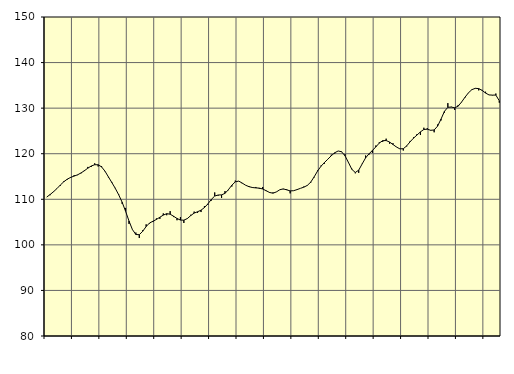
| Category | Piggar | Samtliga anställda (inkl. anställda utomlands) |
|---|---|---|
| nan | 110.5 | 110.49 |
| 87.0 | 110.9 | 111.05 |
| 87.0 | 111.6 | 111.67 |
| 87.0 | 112.4 | 112.37 |
| nan | 113 | 113.15 |
| 88.0 | 114 | 113.86 |
| 88.0 | 114.3 | 114.42 |
| 88.0 | 114.7 | 114.81 |
| nan | 115.3 | 115.09 |
| 89.0 | 115.3 | 115.37 |
| 89.0 | 115.7 | 115.78 |
| 89.0 | 116.4 | 116.27 |
| nan | 117.1 | 116.83 |
| 90.0 | 117.1 | 117.31 |
| 90.0 | 117.9 | 117.58 |
| 90.0 | 117.2 | 117.58 |
| nan | 117.3 | 117.11 |
| 91.0 | 116.1 | 116.16 |
| 91.0 | 114.8 | 114.91 |
| 91.0 | 113.8 | 113.67 |
| nan | 112.5 | 112.4 |
| 92.0 | 111.1 | 110.98 |
| 92.0 | 109 | 109.35 |
| 92.0 | 108.1 | 107.38 |
| nan | 104.6 | 105.23 |
| 93.0 | 103.3 | 103.35 |
| 93.0 | 102.7 | 102.27 |
| 93.0 | 101.5 | 102.23 |
| nan | 103.2 | 102.98 |
| 94.0 | 104.5 | 104.02 |
| 94.0 | 104.7 | 104.8 |
| 94.0 | 105 | 105.19 |
| nan | 105.8 | 105.58 |
| 95.0 | 105.7 | 106.06 |
| 95.0 | 106.9 | 106.53 |
| 95.0 | 106.5 | 106.84 |
| nan | 107.4 | 106.73 |
| 96.0 | 106.1 | 106.28 |
| 96.0 | 105.4 | 105.79 |
| 96.0 | 106.1 | 105.44 |
| nan | 104.8 | 105.42 |
| 97.0 | 105.7 | 105.76 |
| 97.0 | 106.6 | 106.42 |
| 97.0 | 107.3 | 106.97 |
| nan | 107 | 107.26 |
| 98.0 | 107.2 | 107.61 |
| 98.0 | 108.5 | 108.18 |
| 98.0 | 108.8 | 108.98 |
| nan | 109.7 | 109.96 |
| 99.0 | 111.5 | 110.71 |
| 99.0 | 110.8 | 110.94 |
| 99.0 | 110.3 | 110.97 |
| nan | 111.8 | 111.3 |
| 0.0 | 112 | 112.11 |
| 0.0 | 112.8 | 113.09 |
| 0.0 | 114.1 | 113.83 |
| nan | 114 | 113.99 |
| 1.0 | 113.5 | 113.57 |
| 1.0 | 113.1 | 113.09 |
| 1.0 | 112.9 | 112.77 |
| nan | 112.5 | 112.58 |
| 2.0 | 112.7 | 112.5 |
| 2.0 | 112.3 | 112.45 |
| 2.0 | 112.7 | 112.26 |
| nan | 111.8 | 111.88 |
| 3.0 | 111.4 | 111.49 |
| 3.0 | 111.5 | 111.34 |
| 3.0 | 111.6 | 111.62 |
| nan | 112.1 | 112.1 |
| 4.0 | 112.2 | 112.28 |
| 4.0 | 112.2 | 112.07 |
| 4.0 | 111.3 | 111.84 |
| nan | 111.9 | 111.88 |
| 5.0 | 112.1 | 112.12 |
| 5.0 | 112.4 | 112.4 |
| 5.0 | 112.8 | 112.66 |
| nan | 113.1 | 113.04 |
| 6.0 | 113.6 | 113.76 |
| 6.0 | 114.8 | 114.92 |
| 6.0 | 116.3 | 116.2 |
| nan | 117.4 | 117.25 |
| 7.0 | 117.8 | 118.06 |
| 7.0 | 118.8 | 118.8 |
| 7.0 | 119.8 | 119.56 |
| nan | 120 | 120.21 |
| 8.0 | 120.6 | 120.6 |
| 8.0 | 120.5 | 120.43 |
| 8.0 | 119.9 | 119.54 |
| nan | 118 | 118.09 |
| 9.0 | 116.7 | 116.57 |
| 9.0 | 115.7 | 115.88 |
| 9.0 | 115.8 | 116.39 |
| nan | 117.8 | 117.75 |
| 10.0 | 119.6 | 119.08 |
| 10.0 | 119.8 | 119.98 |
| 10.0 | 120.2 | 120.71 |
| nan | 121.8 | 121.5 |
| 11.0 | 122.5 | 122.34 |
| 11.0 | 122.6 | 122.86 |
| 11.0 | 123.3 | 122.89 |
| nan | 122.2 | 122.56 |
| 12.0 | 122.3 | 122.02 |
| 12.0 | 121.5 | 121.47 |
| 12.0 | 121.1 | 121.07 |
| nan | 120.7 | 121.09 |
| 13.0 | 121.6 | 121.72 |
| 13.0 | 122.8 | 122.63 |
| 13.0 | 123.6 | 123.42 |
| nan | 124.3 | 124.1 |
| 14.0 | 124.1 | 124.79 |
| 14.0 | 125.7 | 125.32 |
| 14.0 | 125.6 | 125.38 |
| nan | 125.2 | 125.14 |
| 15.0 | 124.7 | 125.21 |
| 15.0 | 126.4 | 126.05 |
| 15.0 | 127.3 | 127.59 |
| nan | 129 | 129.29 |
| 16.0 | 131.1 | 130.19 |
| 16.0 | 130.3 | 130.23 |
| 16.0 | 129.6 | 130.08 |
| nan | 130.7 | 130.43 |
| 17.0 | 131.3 | 131.34 |
| 17.0 | 132.3 | 132.4 |
| 17.0 | 133.4 | 133.36 |
| nan | 134.1 | 134.05 |
| 18.0 | 134.3 | 134.35 |
| 18.0 | 133.9 | 134.29 |
| 18.0 | 134 | 133.89 |
| nan | 133.6 | 133.31 |
| 19.0 | 132.9 | 132.9 |
| 19.0 | 132.8 | 132.86 |
| 19.0 | 133.2 | 132.87 |
| nan | 131.2 | 131.61 |